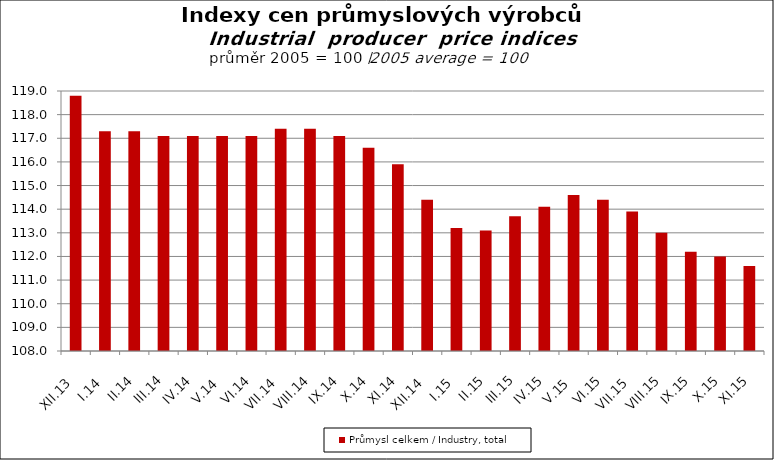
| Category | Průmysl celkem / Industry, total |
|---|---|
| XII.13 | 118.8 |
| I.14 | 117.3 |
| II.14 | 117.3 |
| III.14 | 117.1 |
| IV.14 | 117.1 |
| V.14 | 117.1 |
| VI.14 | 117.1 |
| VII.14 | 117.4 |
| VIII.14 | 117.4 |
| IX.14 | 117.1 |
| X.14 | 116.6 |
| XI.14 | 115.9 |
| XII.14 | 114.4 |
| I.15 | 113.2 |
| II.15 | 113.1 |
| III.15 | 113.7 |
| IV.15 | 114.1 |
| V.15 | 114.6 |
| VI.15 | 114.4 |
| VII.15 | 113.9 |
| VIII.15 | 113 |
| IX.15 | 112.2 |
| X.15 | 112 |
| XI.15 | 111.6 |